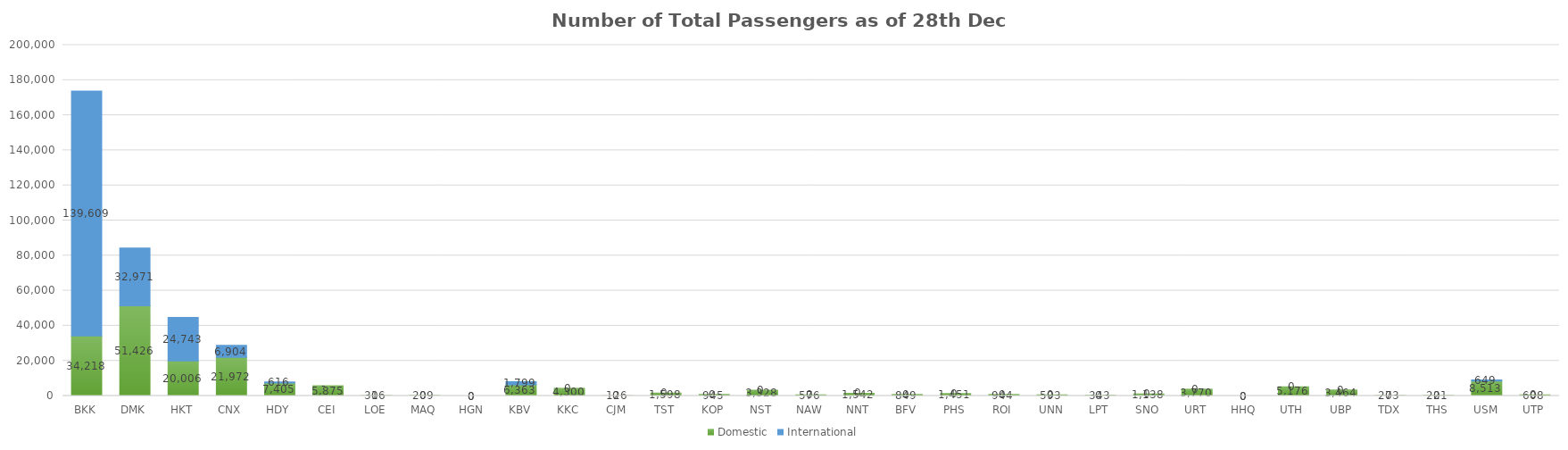
| Category | Domestic | International |
|---|---|---|
| BKK | 34218 | 139609 |
| DMK | 51426 | 32971 |
| HKT | 20006 | 24743 |
| CNX | 21972 | 6904 |
| HDY | 7405 | 616 |
| CEI | 5875 | 0 |
| LOE | 316 | 0 |
| MAQ | 209 | 0 |
| HGN | 0 | 0 |
| KBV | 6363 | 1799 |
| KKC | 4300 | 0 |
| CJM | 126 | 0 |
| TST | 1598 | 0 |
| KOP | 945 | 0 |
| NST | 3328 | 0 |
| NAW | 576 | 0 |
| NNT | 1542 | 0 |
| BFV | 849 | 0 |
| PHS | 1451 | 0 |
| ROI | 944 | 0 |
| UNN | 593 | 0 |
| LPT | 343 | 0 |
| SNO | 1138 | 0 |
| URT | 3770 | 0 |
| HHQ | 0 | 0 |
| UTH | 5176 | 0 |
| UBP | 3464 | 0 |
| TDX | 273 | 0 |
| THS | 221 | 0 |
| USM | 8513 | 649 |
| UTP | 608 | 0 |